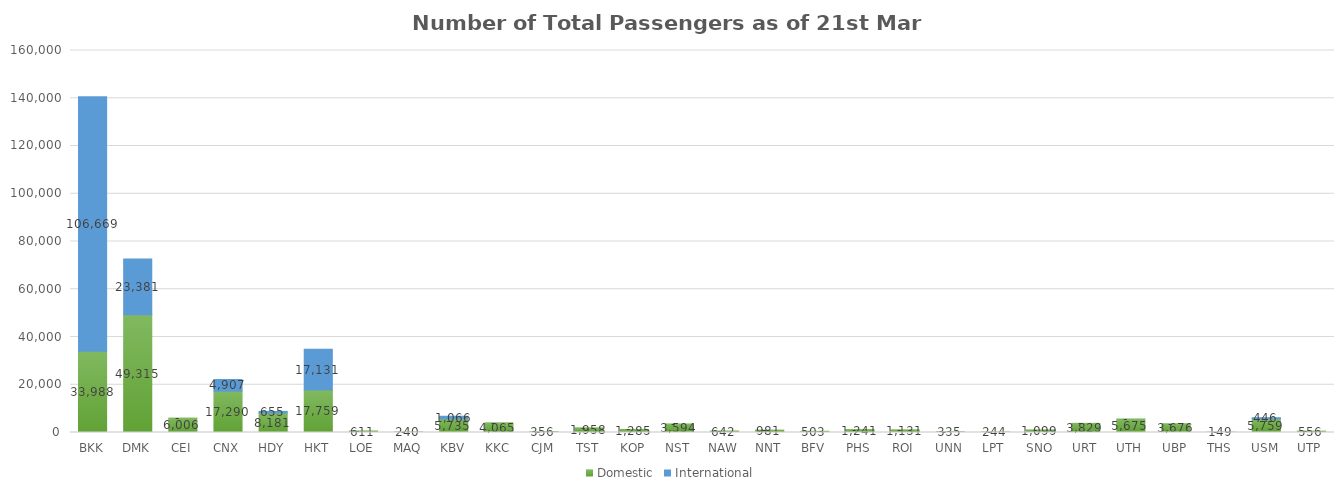
| Category | Domestic | International |
|---|---|---|
| BKK | 33988 | 106669 |
| DMK | 49315 | 23381 |
| CEI | 6006 | 0 |
| CNX | 17290 | 4907 |
| HDY | 8181 | 655 |
| HKT | 17759 | 17131 |
| LOE | 611 | 0 |
| MAQ | 240 | 0 |
| KBV | 5735 | 1066 |
| KKC | 4065 | 0 |
| CJM | 356 | 0 |
| TST | 1958 | 0 |
| KOP | 1285 | 0 |
| NST | 3594 | 0 |
| NAW | 642 | 0 |
| NNT | 981 | 0 |
| BFV | 503 | 0 |
| PHS | 1241 | 0 |
| ROI | 1131 | 0 |
| UNN | 335 | 0 |
| LPT | 244 | 0 |
| SNO | 1099 | 0 |
| URT | 3829 | 0 |
| UTH | 5675 | 0 |
| UBP | 3676 | 0 |
| THS | 149 | 0 |
| USM | 5759 | 446 |
| UTP | 556 | 0 |